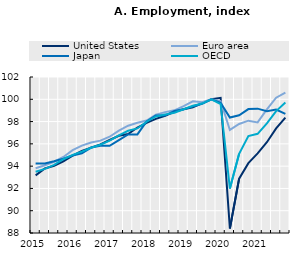
| Category | United States | Euro area | Japan | OECD |
|---|---|---|---|---|
| 2015 | 93.176 | 93.813 | 94.23 | 93.491 |
|  | 93.789 | 94.082 | 94.235 | 93.751 |
|  | 94.033 | 94.394 | 94.437 | 94.105 |
|  | 94.422 | 94.821 | 94.658 | 94.62 |
| 2016 | 94.936 | 95.44 | 94.948 | 95.008 |
|  | 95.366 | 95.84 | 95.149 | 95.307 |
|  | 95.663 | 96.115 | 95.67 | 95.65 |
|  | 95.952 | 96.291 | 95.823 | 95.923 |
| 2017 | 96.348 | 96.639 | 95.823 | 96.29 |
|  | 96.725 | 97.188 | 96.334 | 96.757 |
|  | 96.879 | 97.626 | 96.84 | 97.174 |
|  | 97.463 | 97.892 | 96.845 | 97.383 |
| 2018 | 97.882 | 98.089 | 98.005 | 97.985 |
|  | 98.239 | 98.62 | 98.555 | 98.459 |
|  | 98.519 | 98.847 | 98.535 | 98.631 |
|  | 98.879 | 99.013 | 98.963 | 98.795 |
| 2019 | 99.102 | 99.391 | 99.101 | 99.109 |
|  | 99.279 | 99.817 | 99.346 | 99.423 |
|  | 99.654 | 99.728 | 99.597 | 99.614 |
|  | 100 | 100 | 100 | 100 |
| 2020 | 100.134 | 99.846 | 99.681 | 99.568 |
|  | 88.403 | 97.248 | 98.359 | 91.988 |
|  | 92.875 | 97.784 | 98.57 | 95.113 |
|  | 94.271 | 98.081 | 99.12 | 96.7 |
| 2021 | 95.141 | 97.928 | 99.16 | 96.902 |